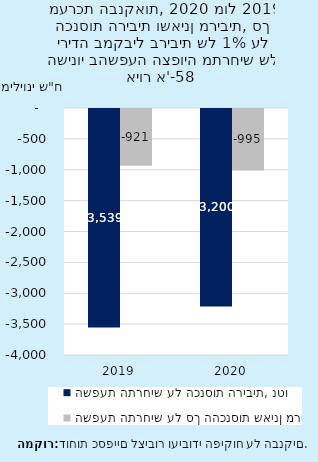
| Category | השפעת התרחיש על הכנסות הריבית, נטו | השפעת התרחיש על סך ההכנסות שאינן מריבית |
|---|---|---|
| 2019.0 | -3539 | -921 |
| 2020.0 | -3200 | -995 |